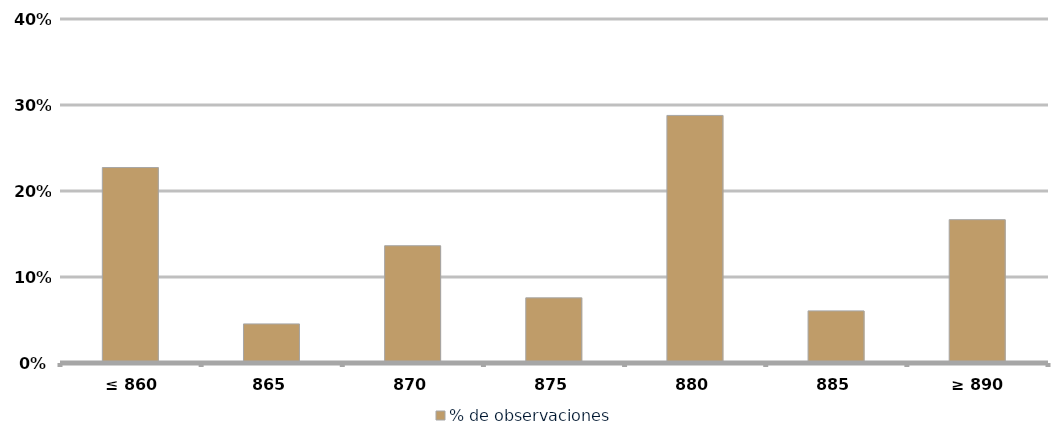
| Category | % de observaciones  |
|---|---|
|  ≤ 860  | 0.227 |
|  865  | 0.045 |
|  870  | 0.136 |
|  875  | 0.076 |
|  880  | 0.288 |
| 885,00 | 0.061 |
|  ≥ 890  | 0.167 |